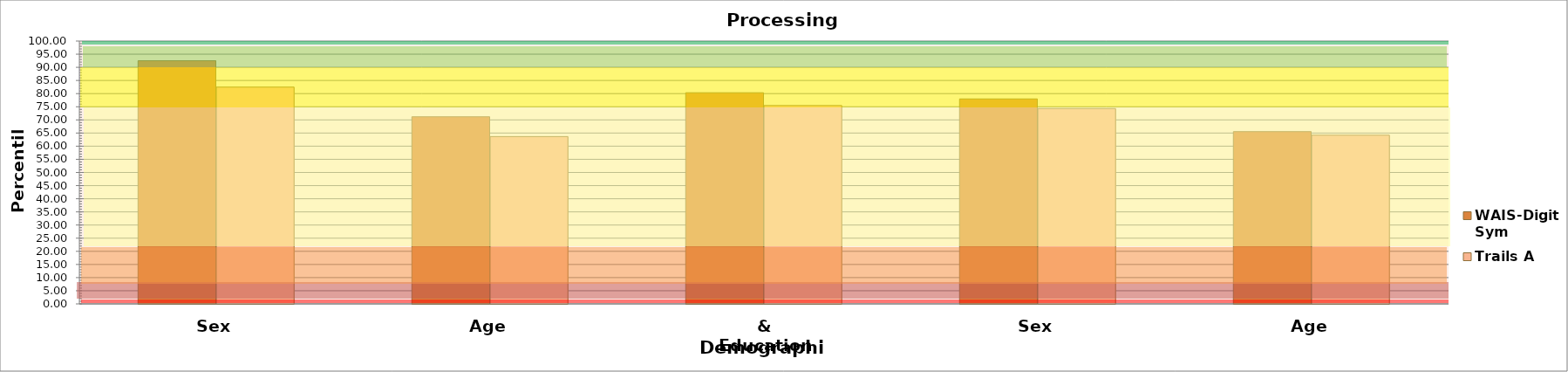
| Category | WAIS-DigitSym | Trails A |
|---|---|---|
| 0 | 92.516 | 82.476 |
| 1 | 71.191 | 63.656 |
| 2 | 80.333 | 75.465 |
| 3 | 77.983 | 74.306 |
| 4 | 65.542 | 64.194 |